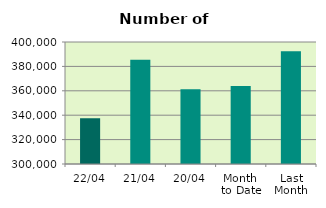
| Category | Series 0 |
|---|---|
| 22/04 | 337462 |
| 21/04 | 385530 |
| 20/04 | 361182 |
| Month 
to Date | 363841.538 |
| Last
Month | 392496.174 |